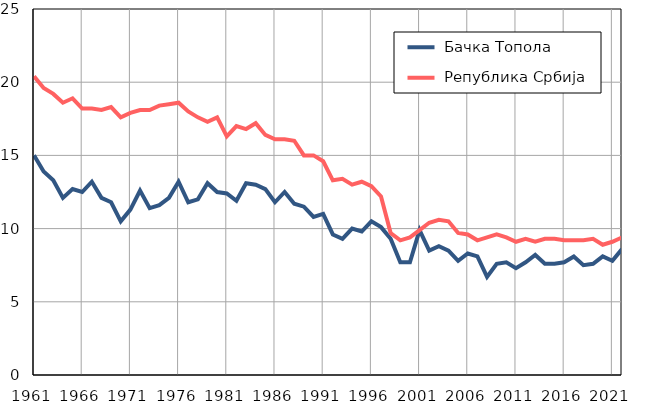
| Category |  Бачка Топола |  Република Србија |
|---|---|---|
| 1961.0 | 15 | 20.4 |
| 1962.0 | 13.9 | 19.6 |
| 1963.0 | 13.3 | 19.2 |
| 1964.0 | 12.1 | 18.6 |
| 1965.0 | 12.7 | 18.9 |
| 1966.0 | 12.5 | 18.2 |
| 1967.0 | 13.2 | 18.2 |
| 1968.0 | 12.1 | 18.1 |
| 1969.0 | 11.8 | 18.3 |
| 1970.0 | 10.5 | 17.6 |
| 1971.0 | 11.3 | 17.9 |
| 1972.0 | 12.6 | 18.1 |
| 1973.0 | 11.4 | 18.1 |
| 1974.0 | 11.6 | 18.4 |
| 1975.0 | 12.1 | 18.5 |
| 1976.0 | 13.2 | 18.6 |
| 1977.0 | 11.8 | 18 |
| 1978.0 | 12 | 17.6 |
| 1979.0 | 13.1 | 17.3 |
| 1980.0 | 12.5 | 17.6 |
| 1981.0 | 12.4 | 16.3 |
| 1982.0 | 11.9 | 17 |
| 1983.0 | 13.1 | 16.8 |
| 1984.0 | 13 | 17.2 |
| 1985.0 | 12.7 | 16.4 |
| 1986.0 | 11.8 | 16.1 |
| 1987.0 | 12.5 | 16.1 |
| 1988.0 | 11.7 | 16 |
| 1989.0 | 11.5 | 15 |
| 1990.0 | 10.8 | 15 |
| 1991.0 | 11 | 14.6 |
| 1992.0 | 9.6 | 13.3 |
| 1993.0 | 9.3 | 13.4 |
| 1994.0 | 10 | 13 |
| 1995.0 | 9.8 | 13.2 |
| 1996.0 | 10.5 | 12.9 |
| 1997.0 | 10.1 | 12.2 |
| 1998.0 | 9.3 | 9.7 |
| 1999.0 | 7.7 | 9.2 |
| 2000.0 | 7.7 | 9.4 |
| 2001.0 | 9.9 | 9.9 |
| 2002.0 | 8.5 | 10.4 |
| 2003.0 | 8.8 | 10.6 |
| 2004.0 | 8.5 | 10.5 |
| 2005.0 | 7.8 | 9.7 |
| 2006.0 | 8.3 | 9.6 |
| 2007.0 | 8.1 | 9.2 |
| 2008.0 | 6.7 | 9.4 |
| 2009.0 | 7.6 | 9.6 |
| 2010.0 | 7.7 | 9.4 |
| 2011.0 | 7.3 | 9.1 |
| 2012.0 | 7.7 | 9.3 |
| 2013.0 | 8.2 | 9.1 |
| 2014.0 | 7.6 | 9.3 |
| 2015.0 | 7.6 | 9.3 |
| 2016.0 | 7.7 | 9.2 |
| 2017.0 | 8.1 | 9.2 |
| 2018.0 | 7.5 | 9.2 |
| 2019.0 | 7.6 | 9.3 |
| 2020.0 | 8.1 | 8.9 |
| 2021.0 | 7.8 | 9.1 |
| 2022.0 | 8.6 | 9.4 |